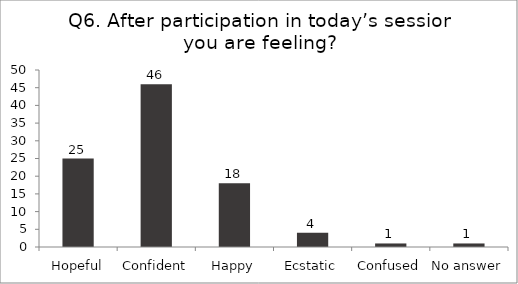
| Category | Q6. After participation in today’s session you are feeling? |
|---|---|
| Hopeful | 25 |
| Confident | 46 |
| Happy | 18 |
| Ecstatic | 4 |
| Confused | 1 |
| No answer | 1 |